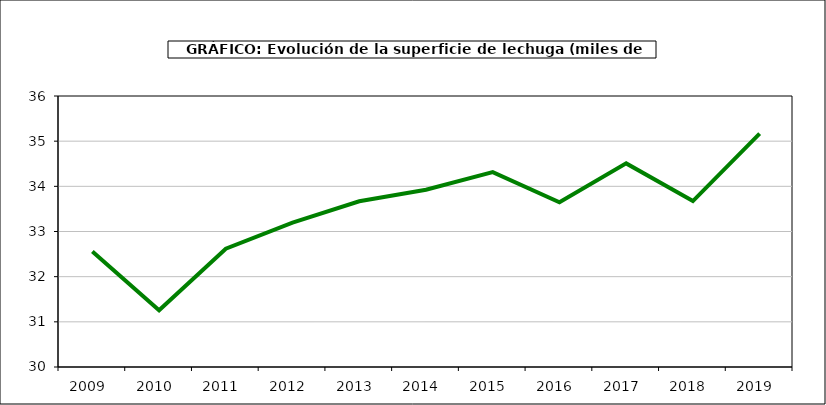
| Category | superficie |
|---|---|
| 2009.0 | 32.557 |
| 2010.0 | 31.256 |
| 2011.0 | 32.62 |
| 2012.0 | 33.196 |
| 2013.0 | 33.669 |
| 2014.0 | 33.924 |
| 2015.0 | 34.314 |
| 2016.0 | 33.646 |
| 2017.0 | 34.508 |
| 2018.0 | 33.674 |
| 2019.0 | 35.168 |